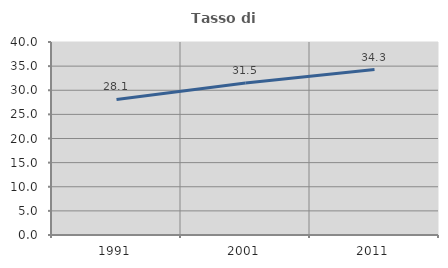
| Category | Tasso di occupazione   |
|---|---|
| 1991.0 | 28.09 |
| 2001.0 | 31.514 |
| 2011.0 | 34.281 |